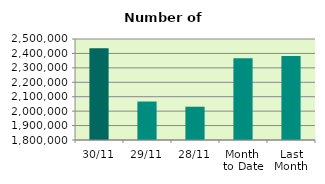
| Category | Series 0 |
|---|---|
| 30/11 | 2436650 |
| 29/11 | 2066608 |
| 28/11 | 2030680 |
| Month 
to Date | 2367033.455 |
| Last
Month | 2382963.143 |